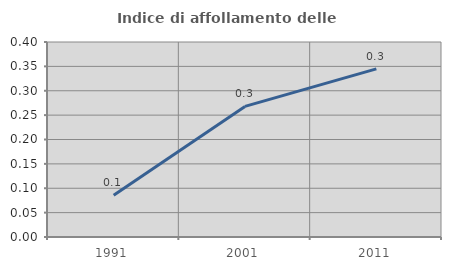
| Category | Indice di affollamento delle abitazioni  |
|---|---|
| 1991.0 | 0.086 |
| 2001.0 | 0.268 |
| 2011.0 | 0.345 |